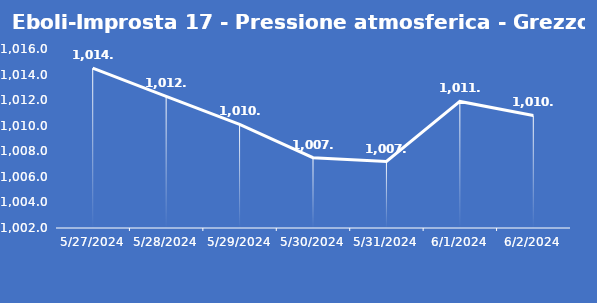
| Category | Eboli-Improsta 17 - Pressione atmosferica - Grezzo (hPa) |
|---|---|
| 5/27/24 | 1014.5 |
| 5/28/24 | 1012.3 |
| 5/29/24 | 1010.1 |
| 5/30/24 | 1007.5 |
| 5/31/24 | 1007.2 |
| 6/1/24 | 1011.9 |
| 6/2/24 | 1010.8 |